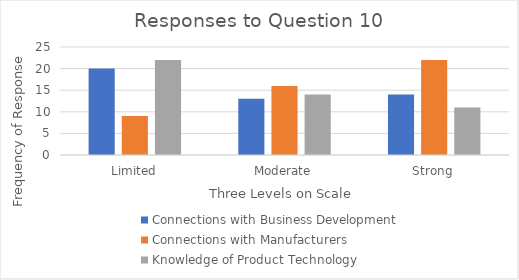
| Category | Connections with Business Development | Connections with Manufacturers | Knowledge of Product Technology |
|---|---|---|---|
| Limited | 20 | 9 | 22 |
| Moderate | 13 | 16 | 14 |
| Strong | 14 | 22 | 11 |